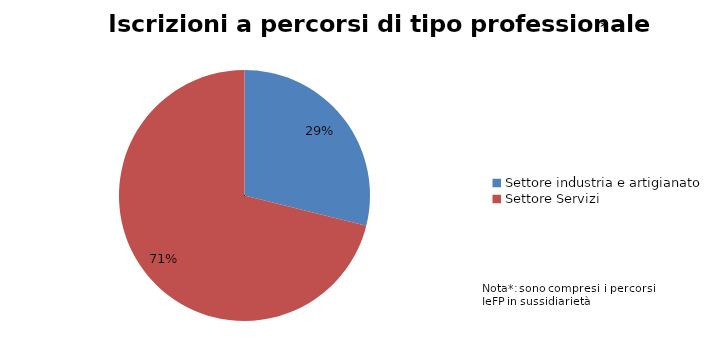
| Category | Series 0 |
|---|---|
| Settore industria e artigianato | 2136 |
| Settore Servizi | 5258 |